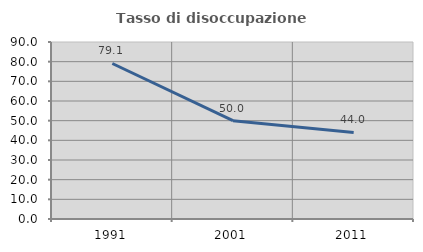
| Category | Tasso di disoccupazione giovanile  |
|---|---|
| 1991.0 | 79.07 |
| 2001.0 | 50 |
| 2011.0 | 44 |